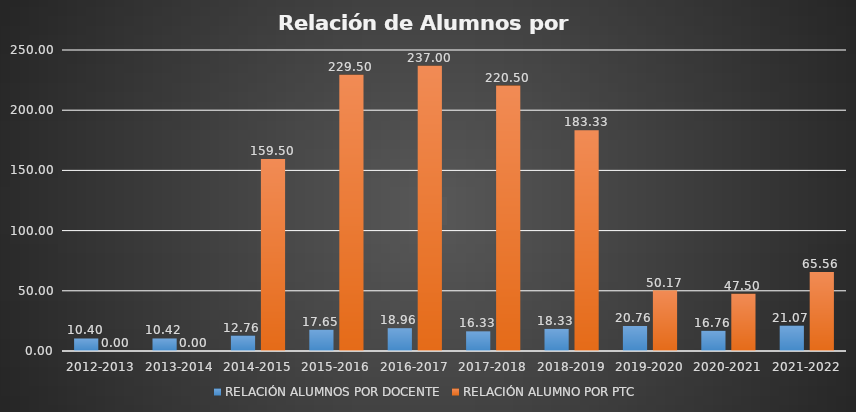
| Category | RELACIÓN ALUMNOS POR DOCENTE | RELACIÓN ALUMNO POR PTC |
|---|---|---|
| 2012-2013 | 10.4 | 0 |
| 2013-2014 | 10.421 | 0 |
| 2014-2015 | 12.76 | 159.5 |
| 2015-2016 | 17.654 | 229.5 |
| 2016-2017 | 18.96 | 237 |
| 2017-2018 | 16.333 | 220.5 |
| 2018-2019 | 18.333 | 183.333 |
| 2019-2020 | 20.759 | 50.167 |
| 2020-2021 | 16.765 | 47.5 |
| 2021-2022 | 21.07 | 65.56 |